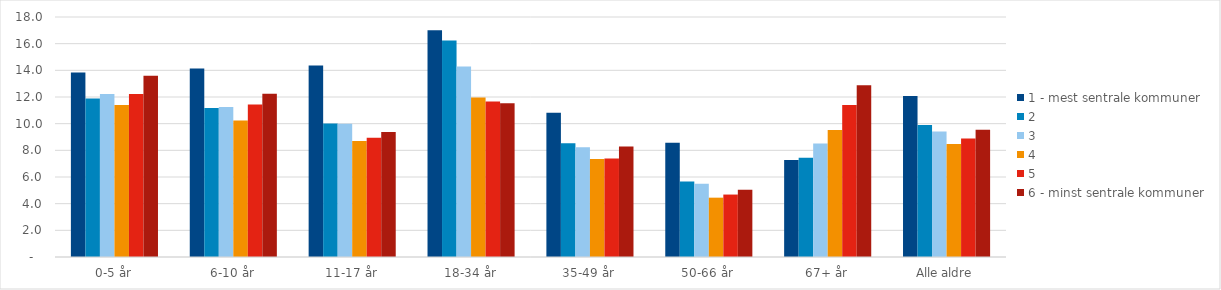
| Category | 1 - mest sentrale kommuner | 2 | 3 | 4 | 5 | 6 - minst sentrale kommuner |
|---|---|---|---|---|---|---|
| 0-5 år | 13.844 | 11.885 | 12.225 | 11.402 | 12.232 | 13.59 |
| 6-10 år | 14.13 | 11.176 | 11.246 | 10.238 | 11.437 | 12.252 |
| 11-17 år | 14.36 | 10.012 | 10.003 | 8.692 | 8.937 | 9.375 |
| 18-34 år | 17.001 | 16.237 | 14.294 | 11.966 | 11.668 | 11.53 |
| 35-49 år | 10.828 | 8.535 | 8.237 | 7.349 | 7.395 | 8.29 |
| 50-66 år | 8.56 | 5.659 | 5.486 | 4.45 | 4.684 | 5.042 |
| 67+ år | 7.278 | 7.438 | 8.503 | 9.524 | 11.404 | 12.885 |
| Alle aldre | 12.075 | 9.904 | 9.408 | 8.479 | 8.889 | 9.55 |